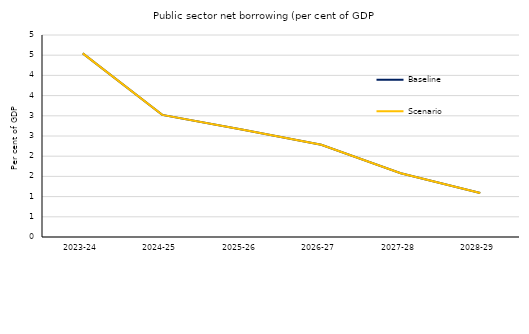
| Category | Baseline | Scenario |
|---|---|---|
| 2023-24 | 4.545 | 4.545 |
| 2024-25 | 3.023 | 3.023 |
| 2025-26 | 2.661 | 2.661 |
| 2026-27 | 2.284 | 2.284 |
| 2027-28 | 1.58 | 1.58 |
| 2028-29 | 1.088 | 1.088 |